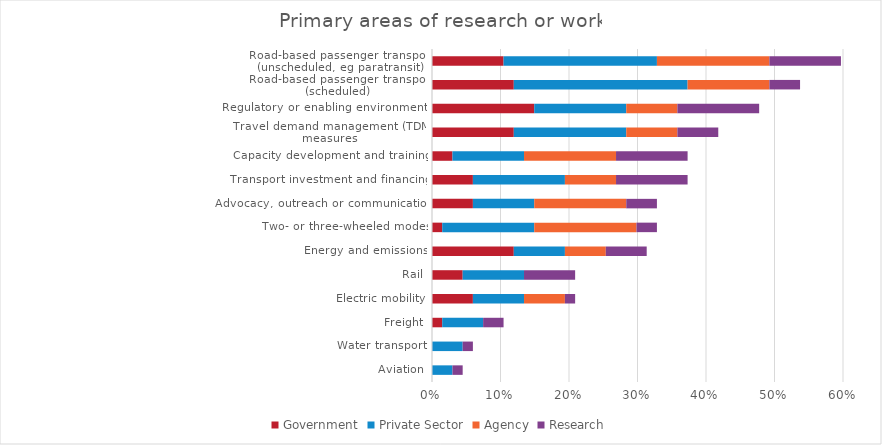
| Category | Government | Private Sector | Agency | Research |
|---|---|---|---|---|
| Aviation | 0 | 0.03 | 0 | 0.015 |
| Water transport | 0 | 0.045 | 0 | 0.015 |
| Freight | 0.015 | 0.06 | 0 | 0.03 |
| Electric mobility | 0.06 | 0.075 | 0.06 | 0.015 |
| Rail | 0.045 | 0.09 | 0 | 0.075 |
| Energy and emissions | 0.119 | 0.075 | 0.06 | 0.06 |
| Two- or three-wheeled modes | 0.015 | 0.134 | 0.149 | 0.03 |
| Advocacy, outreach or communication | 0.06 | 0.09 | 0.134 | 0.045 |
| Transport investment and financing | 0.06 | 0.134 | 0.075 | 0.104 |
| Capacity development and training | 0.03 | 0.104 | 0.134 | 0.104 |
| Travel demand management (TDM) measures | 0.119 | 0.164 | 0.075 | 0.06 |
| Regulatory or enabling environments | 0.149 | 0.134 | 0.075 | 0.119 |
| Road-based passenger transport (scheduled) | 0.119 | 0.254 | 0.119 | 0.045 |
| Road-based passenger transport (unscheduled, eg paratransit) | 0.104 | 0.224 | 0.164 | 0.104 |